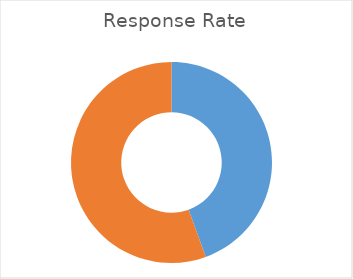
| Category | Total |
|---|---|
| Sum of =Overall Resp | 44.467 |
| Sum of Overall non Resp  | 55.533 |